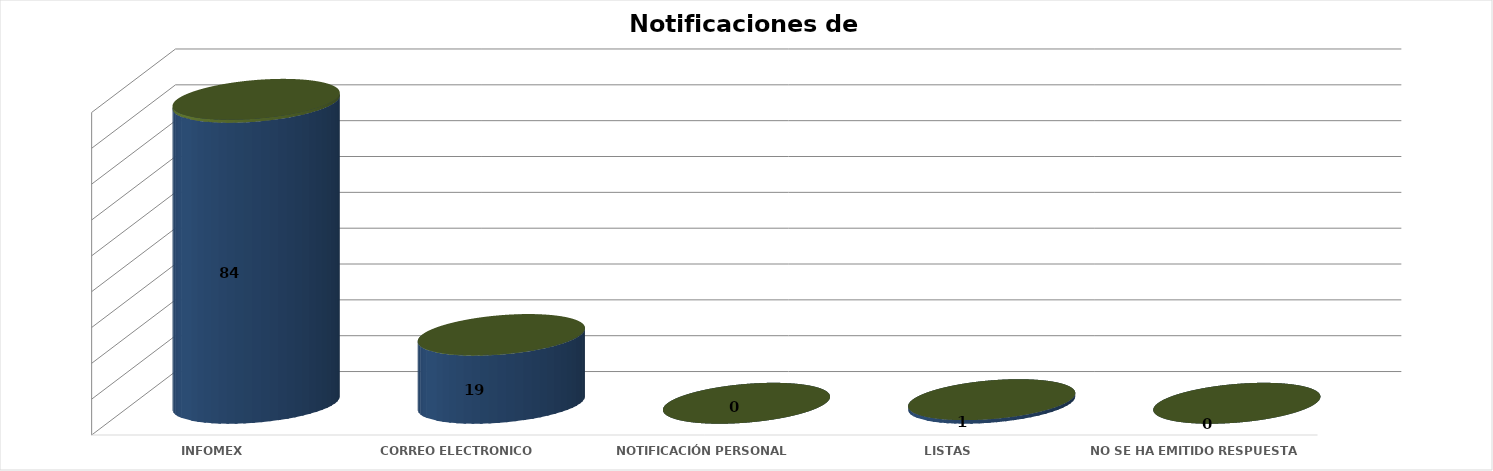
| Category | Series 0 | Series 1 | Series 2 | Series 3 | Series 4 |
|---|---|---|---|---|---|
| INFOMEX |  |  |  | 84 | 0.808 |
| CORREO ELECTRONICO |  |  |  | 19 | 0.183 |
| NOTIFICACIÓN PERSONAL |  |  |  | 0 | 0 |
| LISTAS |  |  |  | 1 | 0.01 |
|  NO SE HA EMITIDO RESPUESTA |  |  |  | 0 | 0 |